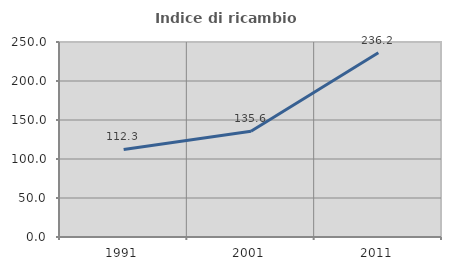
| Category | Indice di ricambio occupazionale  |
|---|---|
| 1991.0 | 112.264 |
| 2001.0 | 135.613 |
| 2011.0 | 236.228 |